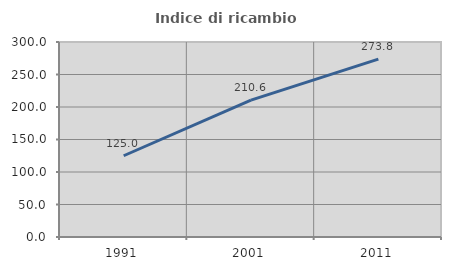
| Category | Indice di ricambio occupazionale  |
|---|---|
| 1991.0 | 125 |
| 2001.0 | 210.588 |
| 2011.0 | 273.75 |